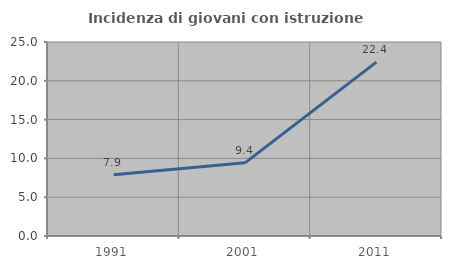
| Category | Incidenza di giovani con istruzione universitaria |
|---|---|
| 1991.0 | 7.891 |
| 2001.0 | 9.426 |
| 2011.0 | 22.414 |